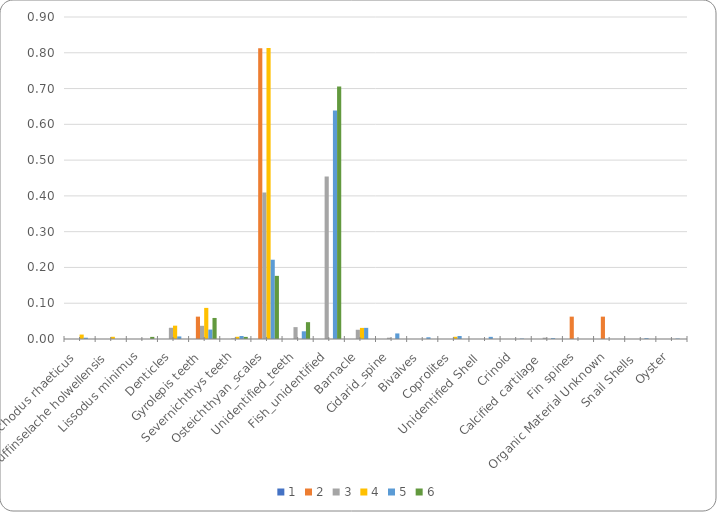
| Category | 1 | 2 | 3 | 4 | 5 | 6 |
|---|---|---|---|---|---|---|
| Synechodus rhaeticus  | 0 | 0 | 0 | 0.012 | 0.004 | 0 |
| Duffinselache holwellensis | 0 | 0 | 0 | 0.006 | 0 | 0 |
| Lissodus minimus | 0 | 0 | 0 | 0 | 0 | 0.006 |
| Denticles | 0 | 0 | 0.031 | 0.037 | 0.007 | 0 |
| Gyrolepis teeth | 0 | 0.062 | 0.037 | 0.087 | 0.026 | 0.059 |
| Severnichthys teeth | 0 | 0 | 0.002 | 0.006 | 0.008 | 0.006 |
| Osteichthyan_scales | 0 | 0.812 | 0.41 | 0.814 | 0.222 | 0.176 |
| Unidentified_teeth | 0 | 0 | 0.033 | 0 | 0.022 | 0.047 |
| Fish_unidentified | 0 | 0 | 0.454 | 0 | 0.638 | 0.706 |
| Barnacle | 0 | 0 | 0.026 | 0.031 | 0.031 | 0 |
| Cidarid_spine | 0 | 0 | 0.004 | 0 | 0.016 | 0 |
| Bivalves | 0 | 0 | 0 | 0 | 0.005 | 0 |
| Coprolites | 0 | 0 | 0 | 0.006 | 0.008 | 0 |
| Unidentified Shell  | 0 | 0 | 0 | 0 | 0.006 | 0 |
| Crinoid | 0 | 0 | 0 | 0 | 0.001 | 0 |
| Calcified cartilage  | 0 | 0 | 0.004 | 0 | 0.002 | 0 |
| Fin spines | 0 | 0.062 | 0 | 0 | 0 | 0 |
| Organic Material Unknown | 0 | 0.062 | 0 | 0 | 0 | 0 |
| Snail Shells  | 0 | 0 | 0 | 0 | 0.002 | 0 |
| Oyster | 0 | 0 | 0 | 0 | 0.001 | 0 |